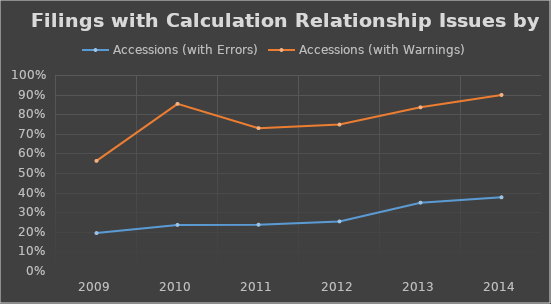
| Category | Accessions (with Errors) | Accessions (with Warnings) |
|---|---|---|
| 2009.0 | 0.194 | 0.562 |
| 2010.0 | 0.235 | 0.853 |
| 2011.0 | 0.236 | 0.729 |
| 2012.0 | 0.253 | 0.747 |
| 2013.0 | 0.349 | 0.835 |
| 2014.0 | 0.376 | 0.898 |